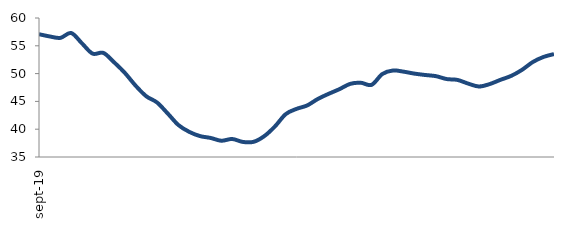
| Category | Series 0 |
|---|---|
| 2019-09-01 | 57.084 |
| 2019-10-01 | 56.682 |
| 2019-11-01 | 56.425 |
| 2019-12-01 | 57.298 |
| 2020-01-01 | 55.449 |
| 2020-02-01 | 53.592 |
| 2020-03-01 | 53.724 |
| 2020-04-01 | 52.032 |
| 2020-05-01 | 50.132 |
| 2020-06-01 | 47.839 |
| 2020-07-01 | 45.923 |
| 2020-08-01 | 44.807 |
| 2020-09-01 | 42.819 |
| 2020-10-01 | 40.739 |
| 2020-11-01 | 39.526 |
| 2020-12-01 | 38.764 |
| 2021-01-01 | 38.426 |
| 2021-02-01 | 37.926 |
| 2021-03-01 | 38.241 |
| 2021-04-01 | 37.709 |
| 2021-05-01 | 37.728 |
| 2021-06-01 | 38.756 |
| 2021-07-01 | 40.518 |
| 2021-08-01 | 42.719 |
| 2021-09-01 | 43.654 |
| 2021-10-01 | 44.278 |
| 2021-11-01 | 45.454 |
| 2021-12-01 | 46.366 |
| 2022-01-01 | 47.2 |
| 2022-02-01 | 48.15 |
| 2022-03-01 | 48.353 |
| 2022-04-01 | 47.979 |
| 2022-05-01 | 49.924 |
| 2022-06-01 | 50.56 |
| 2022-07-01 | 50.34 |
| 2022-08-01 | 49.995 |
| 2022-09-01 | 49.749 |
| 2022-10-01 | 49.539 |
| 2022-11-01 | 49.017 |
| 2022-12-01 | 48.863 |
| 2023-01-01 | 48.201 |
| 2023-02-01 | 47.68 |
| 2023-03-01 | 48.113 |
| 2023-04-01 | 48.873 |
| 2023-05-01 | 49.582 |
| 2023-06-01 | 50.651 |
| 2023-07-01 | 52.053 |
| 2023-08-01 | 52.98 |
| 2023-09-01 | 53.515 |